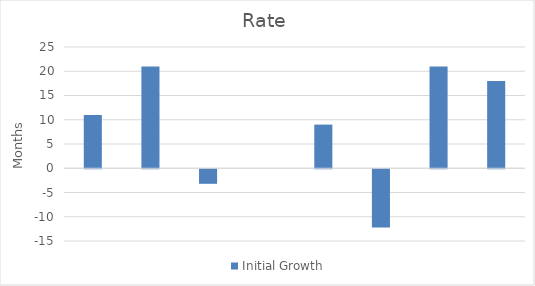
| Category | Initial Growth |
|---|---|
|  | 11 |
|  | 21 |
|  | -3 |
|  | 0 |
|  | 9 |
|  | -12 |
|  | 21 |
|  | 18 |